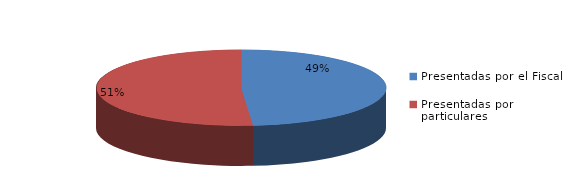
| Category | Series 0 |
|---|---|
| Presentadas por el Fiscal | 130 |
| Presentadas por particulares | 137 |